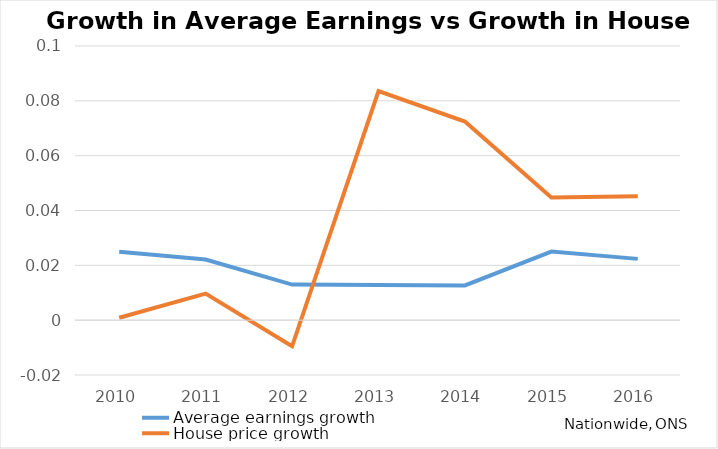
| Category | Average earnings growth | House price growth |
|---|---|---|
| 2010.0 | 0.025 | 0.001 |
| 2011.0 | 0.022 | 0.01 |
| 2012.0 | 0.013 | -0.01 |
| 2013.0 | 0.013 | 0.084 |
| 2014.0 | 0.013 | 0.072 |
| 2015.0 | 0.025 | 0.045 |
| 2016.0 | 0.022 | 0.045 |